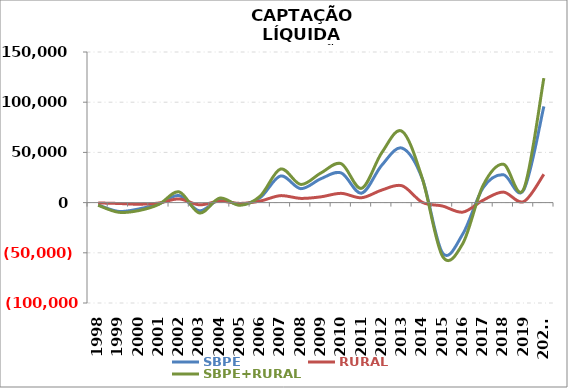
| Category | SBPE | RURAL | SBPE+RURAL |
|---|---|---|---|
| 1998 | -2301.5 | -361.228 | -2662.728 |
| 1999 | -8740.2 | -858.508 | -9598.708 |
| 2000 | -6355.964 | -1615.457 | -7971.421 |
| 2001 | -1319.381 | -412.963 | -1732.344 |
| 2002 | 7008.282 | 3649.972 | 10658.254 |
| 2003 | -8178.886 | -2213.868 | -10392.754 |
| 2004 | 3057.299 | 1425.147 | 4482.446 |
| 2005 | -1869.531 | -826.948 | -2696.479 |
| 2006 | 4963.736 | 1532.919 | 6496.655 |
| 2007 | 26493.6 | 6927.358 | 33420.958 |
| 2008 | 13900.71 | 4187.043 | 18087.753 |
| 2009 | 23813.033 | 5752.651 | 29565.684 |
| 2010 | 29513.472 | 9213.301 | 38726.773 |
| 2011 | 9382.932 | 4844.657 | 14227.589 |
| 2012 | 37239.575 | 12479.984 | 49719.559 |
| 2013 | 54280.749 | 16766.843 | 71047.592 |
| 2014 | 23758.558 | 275.423 | 24033.981 |
| 2015 | -50149.363 | -3418.504 | -53567.867 |
| 2016 | -31222.546 | -9479.207 | -40701.753 |
| 2017 | 14774.799 | 2351.903 | 17126.702 |
| 2018 | 27791.076 | 10469.293 | 38260.369 |
| 2019 | 12389.575 | 937.497 | 13327.072 |
| 2020* | 95805.39 | 28176.418 | 123981.808 |